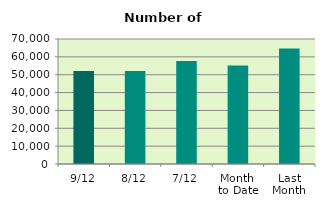
| Category | Series 0 |
|---|---|
| 9/12 | 52042 |
| 8/12 | 52090 |
| 7/12 | 57612 |
| Month 
to Date | 55124.857 |
| Last
Month | 64659.273 |